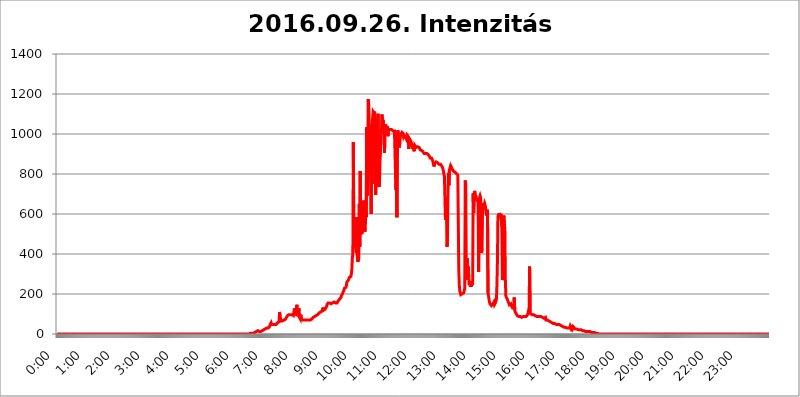
| Category | 2016.09.26. Intenzitás [W/m^2] |
|---|---|
| 0.0 | 0 |
| 0.0006944444444444445 | 0 |
| 0.001388888888888889 | 0 |
| 0.0020833333333333333 | 0 |
| 0.002777777777777778 | 0 |
| 0.003472222222222222 | 0 |
| 0.004166666666666667 | 0 |
| 0.004861111111111111 | 0 |
| 0.005555555555555556 | 0 |
| 0.0062499999999999995 | 0 |
| 0.006944444444444444 | 0 |
| 0.007638888888888889 | 0 |
| 0.008333333333333333 | 0 |
| 0.009027777777777779 | 0 |
| 0.009722222222222222 | 0 |
| 0.010416666666666666 | 0 |
| 0.011111111111111112 | 0 |
| 0.011805555555555555 | 0 |
| 0.012499999999999999 | 0 |
| 0.013194444444444444 | 0 |
| 0.013888888888888888 | 0 |
| 0.014583333333333332 | 0 |
| 0.015277777777777777 | 0 |
| 0.015972222222222224 | 0 |
| 0.016666666666666666 | 0 |
| 0.017361111111111112 | 0 |
| 0.018055555555555557 | 0 |
| 0.01875 | 0 |
| 0.019444444444444445 | 0 |
| 0.02013888888888889 | 0 |
| 0.020833333333333332 | 0 |
| 0.02152777777777778 | 0 |
| 0.022222222222222223 | 0 |
| 0.02291666666666667 | 0 |
| 0.02361111111111111 | 0 |
| 0.024305555555555556 | 0 |
| 0.024999999999999998 | 0 |
| 0.025694444444444447 | 0 |
| 0.02638888888888889 | 0 |
| 0.027083333333333334 | 0 |
| 0.027777777777777776 | 0 |
| 0.02847222222222222 | 0 |
| 0.029166666666666664 | 0 |
| 0.029861111111111113 | 0 |
| 0.030555555555555555 | 0 |
| 0.03125 | 0 |
| 0.03194444444444445 | 0 |
| 0.03263888888888889 | 0 |
| 0.03333333333333333 | 0 |
| 0.034027777777777775 | 0 |
| 0.034722222222222224 | 0 |
| 0.035416666666666666 | 0 |
| 0.036111111111111115 | 0 |
| 0.03680555555555556 | 0 |
| 0.0375 | 0 |
| 0.03819444444444444 | 0 |
| 0.03888888888888889 | 0 |
| 0.03958333333333333 | 0 |
| 0.04027777777777778 | 0 |
| 0.04097222222222222 | 0 |
| 0.041666666666666664 | 0 |
| 0.042361111111111106 | 0 |
| 0.04305555555555556 | 0 |
| 0.043750000000000004 | 0 |
| 0.044444444444444446 | 0 |
| 0.04513888888888889 | 0 |
| 0.04583333333333334 | 0 |
| 0.04652777777777778 | 0 |
| 0.04722222222222222 | 0 |
| 0.04791666666666666 | 0 |
| 0.04861111111111111 | 0 |
| 0.049305555555555554 | 0 |
| 0.049999999999999996 | 0 |
| 0.05069444444444445 | 0 |
| 0.051388888888888894 | 0 |
| 0.052083333333333336 | 0 |
| 0.05277777777777778 | 0 |
| 0.05347222222222222 | 0 |
| 0.05416666666666667 | 0 |
| 0.05486111111111111 | 0 |
| 0.05555555555555555 | 0 |
| 0.05625 | 0 |
| 0.05694444444444444 | 0 |
| 0.057638888888888885 | 0 |
| 0.05833333333333333 | 0 |
| 0.05902777777777778 | 0 |
| 0.059722222222222225 | 0 |
| 0.06041666666666667 | 0 |
| 0.061111111111111116 | 0 |
| 0.06180555555555556 | 0 |
| 0.0625 | 0 |
| 0.06319444444444444 | 0 |
| 0.06388888888888888 | 0 |
| 0.06458333333333334 | 0 |
| 0.06527777777777778 | 0 |
| 0.06597222222222222 | 0 |
| 0.06666666666666667 | 0 |
| 0.06736111111111111 | 0 |
| 0.06805555555555555 | 0 |
| 0.06874999999999999 | 0 |
| 0.06944444444444443 | 0 |
| 0.07013888888888889 | 0 |
| 0.07083333333333333 | 0 |
| 0.07152777777777779 | 0 |
| 0.07222222222222223 | 0 |
| 0.07291666666666667 | 0 |
| 0.07361111111111111 | 0 |
| 0.07430555555555556 | 0 |
| 0.075 | 0 |
| 0.07569444444444444 | 0 |
| 0.0763888888888889 | 0 |
| 0.07708333333333334 | 0 |
| 0.07777777777777778 | 0 |
| 0.07847222222222222 | 0 |
| 0.07916666666666666 | 0 |
| 0.0798611111111111 | 0 |
| 0.08055555555555556 | 0 |
| 0.08125 | 0 |
| 0.08194444444444444 | 0 |
| 0.08263888888888889 | 0 |
| 0.08333333333333333 | 0 |
| 0.08402777777777777 | 0 |
| 0.08472222222222221 | 0 |
| 0.08541666666666665 | 0 |
| 0.08611111111111112 | 0 |
| 0.08680555555555557 | 0 |
| 0.08750000000000001 | 0 |
| 0.08819444444444445 | 0 |
| 0.08888888888888889 | 0 |
| 0.08958333333333333 | 0 |
| 0.09027777777777778 | 0 |
| 0.09097222222222222 | 0 |
| 0.09166666666666667 | 0 |
| 0.09236111111111112 | 0 |
| 0.09305555555555556 | 0 |
| 0.09375 | 0 |
| 0.09444444444444444 | 0 |
| 0.09513888888888888 | 0 |
| 0.09583333333333333 | 0 |
| 0.09652777777777777 | 0 |
| 0.09722222222222222 | 0 |
| 0.09791666666666667 | 0 |
| 0.09861111111111111 | 0 |
| 0.09930555555555555 | 0 |
| 0.09999999999999999 | 0 |
| 0.10069444444444443 | 0 |
| 0.1013888888888889 | 0 |
| 0.10208333333333335 | 0 |
| 0.10277777777777779 | 0 |
| 0.10347222222222223 | 0 |
| 0.10416666666666667 | 0 |
| 0.10486111111111111 | 0 |
| 0.10555555555555556 | 0 |
| 0.10625 | 0 |
| 0.10694444444444444 | 0 |
| 0.1076388888888889 | 0 |
| 0.10833333333333334 | 0 |
| 0.10902777777777778 | 0 |
| 0.10972222222222222 | 0 |
| 0.1111111111111111 | 0 |
| 0.11180555555555556 | 0 |
| 0.11180555555555556 | 0 |
| 0.1125 | 0 |
| 0.11319444444444444 | 0 |
| 0.11388888888888889 | 0 |
| 0.11458333333333333 | 0 |
| 0.11527777777777777 | 0 |
| 0.11597222222222221 | 0 |
| 0.11666666666666665 | 0 |
| 0.1173611111111111 | 0 |
| 0.11805555555555557 | 0 |
| 0.11944444444444445 | 0 |
| 0.12013888888888889 | 0 |
| 0.12083333333333333 | 0 |
| 0.12152777777777778 | 0 |
| 0.12222222222222223 | 0 |
| 0.12291666666666667 | 0 |
| 0.12291666666666667 | 0 |
| 0.12361111111111112 | 0 |
| 0.12430555555555556 | 0 |
| 0.125 | 0 |
| 0.12569444444444444 | 0 |
| 0.12638888888888888 | 0 |
| 0.12708333333333333 | 0 |
| 0.16875 | 0 |
| 0.12847222222222224 | 0 |
| 0.12916666666666668 | 0 |
| 0.12986111111111112 | 0 |
| 0.13055555555555556 | 0 |
| 0.13125 | 0 |
| 0.13194444444444445 | 0 |
| 0.1326388888888889 | 0 |
| 0.13333333333333333 | 0 |
| 0.13402777777777777 | 0 |
| 0.13402777777777777 | 0 |
| 0.13472222222222222 | 0 |
| 0.13541666666666666 | 0 |
| 0.1361111111111111 | 0 |
| 0.13749999999999998 | 0 |
| 0.13819444444444443 | 0 |
| 0.1388888888888889 | 0 |
| 0.13958333333333334 | 0 |
| 0.14027777777777778 | 0 |
| 0.14097222222222222 | 0 |
| 0.14166666666666666 | 0 |
| 0.1423611111111111 | 0 |
| 0.14305555555555557 | 0 |
| 0.14375000000000002 | 0 |
| 0.14444444444444446 | 0 |
| 0.1451388888888889 | 0 |
| 0.1451388888888889 | 0 |
| 0.14652777777777778 | 0 |
| 0.14722222222222223 | 0 |
| 0.14791666666666667 | 0 |
| 0.1486111111111111 | 0 |
| 0.14930555555555555 | 0 |
| 0.15 | 0 |
| 0.15069444444444444 | 0 |
| 0.15138888888888888 | 0 |
| 0.15208333333333332 | 0 |
| 0.15277777777777776 | 0 |
| 0.15347222222222223 | 0 |
| 0.15416666666666667 | 0 |
| 0.15486111111111112 | 0 |
| 0.15555555555555556 | 0 |
| 0.15625 | 0 |
| 0.15694444444444444 | 0 |
| 0.15763888888888888 | 0 |
| 0.15833333333333333 | 0 |
| 0.15902777777777777 | 0 |
| 0.15972222222222224 | 0 |
| 0.16041666666666668 | 0 |
| 0.16111111111111112 | 0 |
| 0.16180555555555556 | 0 |
| 0.1625 | 0 |
| 0.16319444444444445 | 0 |
| 0.1638888888888889 | 0 |
| 0.16458333333333333 | 0 |
| 0.16527777777777777 | 0 |
| 0.16597222222222222 | 0 |
| 0.16666666666666666 | 0 |
| 0.1673611111111111 | 0 |
| 0.16805555555555554 | 0 |
| 0.16874999999999998 | 0 |
| 0.16944444444444443 | 0 |
| 0.17013888888888887 | 0 |
| 0.1708333333333333 | 0 |
| 0.17152777777777775 | 0 |
| 0.17222222222222225 | 0 |
| 0.1729166666666667 | 0 |
| 0.17361111111111113 | 0 |
| 0.17430555555555557 | 0 |
| 0.17500000000000002 | 0 |
| 0.17569444444444446 | 0 |
| 0.1763888888888889 | 0 |
| 0.17708333333333334 | 0 |
| 0.17777777777777778 | 0 |
| 0.17847222222222223 | 0 |
| 0.17916666666666667 | 0 |
| 0.1798611111111111 | 0 |
| 0.18055555555555555 | 0 |
| 0.18125 | 0 |
| 0.18194444444444444 | 0 |
| 0.1826388888888889 | 0 |
| 0.18333333333333335 | 0 |
| 0.1840277777777778 | 0 |
| 0.18472222222222223 | 0 |
| 0.18541666666666667 | 0 |
| 0.18611111111111112 | 0 |
| 0.18680555555555556 | 0 |
| 0.1875 | 0 |
| 0.18819444444444444 | 0 |
| 0.18888888888888888 | 0 |
| 0.18958333333333333 | 0 |
| 0.19027777777777777 | 0 |
| 0.1909722222222222 | 0 |
| 0.19166666666666665 | 0 |
| 0.19236111111111112 | 0 |
| 0.19305555555555554 | 0 |
| 0.19375 | 0 |
| 0.19444444444444445 | 0 |
| 0.1951388888888889 | 0 |
| 0.19583333333333333 | 0 |
| 0.19652777777777777 | 0 |
| 0.19722222222222222 | 0 |
| 0.19791666666666666 | 0 |
| 0.1986111111111111 | 0 |
| 0.19930555555555554 | 0 |
| 0.19999999999999998 | 0 |
| 0.20069444444444443 | 0 |
| 0.20138888888888887 | 0 |
| 0.2020833333333333 | 0 |
| 0.2027777777777778 | 0 |
| 0.2034722222222222 | 0 |
| 0.2041666666666667 | 0 |
| 0.20486111111111113 | 0 |
| 0.20555555555555557 | 0 |
| 0.20625000000000002 | 0 |
| 0.20694444444444446 | 0 |
| 0.2076388888888889 | 0 |
| 0.20833333333333334 | 0 |
| 0.20902777777777778 | 0 |
| 0.20972222222222223 | 0 |
| 0.21041666666666667 | 0 |
| 0.2111111111111111 | 0 |
| 0.21180555555555555 | 0 |
| 0.2125 | 0 |
| 0.21319444444444444 | 0 |
| 0.2138888888888889 | 0 |
| 0.21458333333333335 | 0 |
| 0.2152777777777778 | 0 |
| 0.21597222222222223 | 0 |
| 0.21666666666666667 | 0 |
| 0.21736111111111112 | 0 |
| 0.21805555555555556 | 0 |
| 0.21875 | 0 |
| 0.21944444444444444 | 0 |
| 0.22013888888888888 | 0 |
| 0.22083333333333333 | 0 |
| 0.22152777777777777 | 0 |
| 0.2222222222222222 | 0 |
| 0.22291666666666665 | 0 |
| 0.2236111111111111 | 0 |
| 0.22430555555555556 | 0 |
| 0.225 | 0 |
| 0.22569444444444445 | 0 |
| 0.2263888888888889 | 0 |
| 0.22708333333333333 | 0 |
| 0.22777777777777777 | 0 |
| 0.22847222222222222 | 0 |
| 0.22916666666666666 | 0 |
| 0.2298611111111111 | 0 |
| 0.23055555555555554 | 0 |
| 0.23124999999999998 | 0 |
| 0.23194444444444443 | 0 |
| 0.23263888888888887 | 0 |
| 0.2333333333333333 | 0 |
| 0.2340277777777778 | 0 |
| 0.2347222222222222 | 0 |
| 0.2354166666666667 | 0 |
| 0.23611111111111113 | 0 |
| 0.23680555555555557 | 0 |
| 0.23750000000000002 | 0 |
| 0.23819444444444446 | 0 |
| 0.2388888888888889 | 0 |
| 0.23958333333333334 | 0 |
| 0.24027777777777778 | 0 |
| 0.24097222222222223 | 0 |
| 0.24166666666666667 | 0 |
| 0.2423611111111111 | 0 |
| 0.24305555555555555 | 0 |
| 0.24375 | 0 |
| 0.24444444444444446 | 0 |
| 0.24513888888888888 | 0 |
| 0.24583333333333335 | 0 |
| 0.2465277777777778 | 0 |
| 0.24722222222222223 | 0 |
| 0.24791666666666667 | 0 |
| 0.24861111111111112 | 0 |
| 0.24930555555555556 | 0 |
| 0.25 | 0 |
| 0.25069444444444444 | 0 |
| 0.2513888888888889 | 0 |
| 0.2520833333333333 | 0 |
| 0.25277777777777777 | 0 |
| 0.2534722222222222 | 0 |
| 0.25416666666666665 | 0 |
| 0.2548611111111111 | 0 |
| 0.2555555555555556 | 0 |
| 0.25625000000000003 | 0 |
| 0.2569444444444445 | 0 |
| 0.2576388888888889 | 0 |
| 0.25833333333333336 | 0 |
| 0.2590277777777778 | 0 |
| 0.25972222222222224 | 0 |
| 0.2604166666666667 | 0 |
| 0.2611111111111111 | 0 |
| 0.26180555555555557 | 0 |
| 0.2625 | 0 |
| 0.26319444444444445 | 0 |
| 0.2638888888888889 | 0 |
| 0.26458333333333334 | 0 |
| 0.2652777777777778 | 0 |
| 0.2659722222222222 | 0 |
| 0.26666666666666666 | 0 |
| 0.2673611111111111 | 0 |
| 0.26805555555555555 | 0 |
| 0.26875 | 0 |
| 0.26944444444444443 | 0 |
| 0.2701388888888889 | 3.525 |
| 0.2708333333333333 | 3.525 |
| 0.27152777777777776 | 3.525 |
| 0.2722222222222222 | 3.525 |
| 0.27291666666666664 | 3.525 |
| 0.2736111111111111 | 3.525 |
| 0.2743055555555555 | 3.525 |
| 0.27499999999999997 | 3.525 |
| 0.27569444444444446 | 3.525 |
| 0.27638888888888885 | 7.887 |
| 0.27708333333333335 | 7.887 |
| 0.2777777777777778 | 12.257 |
| 0.27847222222222223 | 12.257 |
| 0.2791666666666667 | 12.257 |
| 0.2798611111111111 | 16.636 |
| 0.28055555555555556 | 16.636 |
| 0.28125 | 16.636 |
| 0.28194444444444444 | 16.636 |
| 0.2826388888888889 | 16.636 |
| 0.2833333333333333 | 12.257 |
| 0.28402777777777777 | 12.257 |
| 0.2847222222222222 | 12.257 |
| 0.28541666666666665 | 12.257 |
| 0.28611111111111115 | 16.636 |
| 0.28680555555555554 | 16.636 |
| 0.28750000000000003 | 16.636 |
| 0.2881944444444445 | 16.636 |
| 0.2888888888888889 | 21.024 |
| 0.28958333333333336 | 21.024 |
| 0.2902777777777778 | 21.024 |
| 0.29097222222222224 | 25.419 |
| 0.2916666666666667 | 25.419 |
| 0.2923611111111111 | 25.419 |
| 0.29305555555555557 | 25.419 |
| 0.29375 | 29.823 |
| 0.29444444444444445 | 29.823 |
| 0.2951388888888889 | 29.823 |
| 0.29583333333333334 | 29.823 |
| 0.2965277777777778 | 34.234 |
| 0.2972222222222222 | 34.234 |
| 0.29791666666666666 | 38.653 |
| 0.2986111111111111 | 47.511 |
| 0.29930555555555555 | 47.511 |
| 0.3 | 56.398 |
| 0.30069444444444443 | 47.511 |
| 0.3013888888888889 | 47.511 |
| 0.3020833333333333 | 47.511 |
| 0.30277777777777776 | 47.511 |
| 0.3034722222222222 | 43.079 |
| 0.30416666666666664 | 47.511 |
| 0.3048611111111111 | 47.511 |
| 0.3055555555555555 | 47.511 |
| 0.30624999999999997 | 47.511 |
| 0.3069444444444444 | 47.511 |
| 0.3076388888888889 | 51.951 |
| 0.30833333333333335 | 51.951 |
| 0.3090277777777778 | 56.398 |
| 0.30972222222222223 | 56.398 |
| 0.3104166666666667 | 60.85 |
| 0.3111111111111111 | 60.85 |
| 0.31180555555555556 | 110.201 |
| 0.3125 | 87.692 |
| 0.31319444444444444 | 78.722 |
| 0.3138888888888889 | 65.31 |
| 0.3145833333333333 | 65.31 |
| 0.31527777777777777 | 65.31 |
| 0.3159722222222222 | 65.31 |
| 0.31666666666666665 | 65.31 |
| 0.31736111111111115 | 65.31 |
| 0.31805555555555554 | 69.775 |
| 0.31875000000000003 | 74.246 |
| 0.3194444444444445 | 74.246 |
| 0.3201388888888889 | 74.246 |
| 0.32083333333333336 | 78.722 |
| 0.3215277777777778 | 83.205 |
| 0.32222222222222224 | 83.205 |
| 0.3229166666666667 | 92.184 |
| 0.3236111111111111 | 92.184 |
| 0.32430555555555557 | 96.682 |
| 0.325 | 96.682 |
| 0.32569444444444445 | 96.682 |
| 0.3263888888888889 | 96.682 |
| 0.32708333333333334 | 96.682 |
| 0.3277777777777778 | 96.682 |
| 0.3284722222222222 | 92.184 |
| 0.32916666666666666 | 96.682 |
| 0.3298611111111111 | 92.184 |
| 0.33055555555555555 | 92.184 |
| 0.33125 | 92.184 |
| 0.33194444444444443 | 96.682 |
| 0.3326388888888889 | 128.284 |
| 0.3333333333333333 | 101.184 |
| 0.3340277777777778 | 101.184 |
| 0.3347222222222222 | 101.184 |
| 0.3354166666666667 | 96.682 |
| 0.3361111111111111 | 146.423 |
| 0.3368055555555556 | 96.682 |
| 0.33749999999999997 | 92.184 |
| 0.33819444444444446 | 92.184 |
| 0.33888888888888885 | 128.284 |
| 0.33958333333333335 | 83.205 |
| 0.34027777777777773 | 78.722 |
| 0.34097222222222223 | 74.246 |
| 0.3416666666666666 | 96.682 |
| 0.3423611111111111 | 74.246 |
| 0.3430555555555555 | 69.775 |
| 0.34375 | 69.775 |
| 0.3444444444444445 | 69.775 |
| 0.3451388888888889 | 69.775 |
| 0.3458333333333334 | 69.775 |
| 0.34652777777777777 | 69.775 |
| 0.34722222222222227 | 69.775 |
| 0.34791666666666665 | 69.775 |
| 0.34861111111111115 | 69.775 |
| 0.34930555555555554 | 69.775 |
| 0.35000000000000003 | 69.775 |
| 0.3506944444444444 | 69.775 |
| 0.3513888888888889 | 69.775 |
| 0.3520833333333333 | 69.775 |
| 0.3527777777777778 | 69.775 |
| 0.3534722222222222 | 69.775 |
| 0.3541666666666667 | 69.775 |
| 0.3548611111111111 | 69.775 |
| 0.35555555555555557 | 74.246 |
| 0.35625 | 74.246 |
| 0.35694444444444445 | 74.246 |
| 0.3576388888888889 | 74.246 |
| 0.35833333333333334 | 78.722 |
| 0.3590277777777778 | 83.205 |
| 0.3597222222222222 | 83.205 |
| 0.36041666666666666 | 83.205 |
| 0.3611111111111111 | 87.692 |
| 0.36180555555555555 | 87.692 |
| 0.3625 | 92.184 |
| 0.36319444444444443 | 92.184 |
| 0.3638888888888889 | 92.184 |
| 0.3645833333333333 | 96.682 |
| 0.3652777777777778 | 96.682 |
| 0.3659722222222222 | 101.184 |
| 0.3666666666666667 | 101.184 |
| 0.3673611111111111 | 105.69 |
| 0.3680555555555556 | 110.201 |
| 0.36874999999999997 | 110.201 |
| 0.36944444444444446 | 110.201 |
| 0.37013888888888885 | 110.201 |
| 0.37083333333333335 | 110.201 |
| 0.37152777777777773 | 114.716 |
| 0.37222222222222223 | 119.235 |
| 0.3729166666666666 | 132.814 |
| 0.3736111111111111 | 119.235 |
| 0.3743055555555555 | 123.758 |
| 0.375 | 123.758 |
| 0.3756944444444445 | 123.758 |
| 0.3763888888888889 | 128.284 |
| 0.3770833333333334 | 132.814 |
| 0.37777777777777777 | 137.347 |
| 0.37847222222222227 | 146.423 |
| 0.37916666666666665 | 150.964 |
| 0.37986111111111115 | 155.509 |
| 0.38055555555555554 | 155.509 |
| 0.38125000000000003 | 155.509 |
| 0.3819444444444444 | 155.509 |
| 0.3826388888888889 | 155.509 |
| 0.3833333333333333 | 150.964 |
| 0.3840277777777778 | 150.964 |
| 0.3847222222222222 | 155.509 |
| 0.3854166666666667 | 155.509 |
| 0.3861111111111111 | 155.509 |
| 0.38680555555555557 | 160.056 |
| 0.3875 | 160.056 |
| 0.38819444444444445 | 160.056 |
| 0.3888888888888889 | 160.056 |
| 0.38958333333333334 | 155.509 |
| 0.3902777777777778 | 155.509 |
| 0.3909722222222222 | 155.509 |
| 0.39166666666666666 | 155.509 |
| 0.3923611111111111 | 155.509 |
| 0.39305555555555555 | 160.056 |
| 0.39375 | 164.605 |
| 0.39444444444444443 | 164.605 |
| 0.3951388888888889 | 169.156 |
| 0.3958333333333333 | 173.709 |
| 0.3965277777777778 | 173.709 |
| 0.3972222222222222 | 178.264 |
| 0.3979166666666667 | 182.82 |
| 0.3986111111111111 | 191.937 |
| 0.3993055555555556 | 196.497 |
| 0.39999999999999997 | 201.058 |
| 0.40069444444444446 | 201.058 |
| 0.40138888888888885 | 205.62 |
| 0.40208333333333335 | 219.309 |
| 0.40277777777777773 | 228.436 |
| 0.40347222222222223 | 233 |
| 0.4041666666666666 | 233 |
| 0.4048611111111111 | 233 |
| 0.4055555555555555 | 242.127 |
| 0.40625 | 260.373 |
| 0.4069444444444445 | 260.373 |
| 0.4076388888888889 | 264.932 |
| 0.4083333333333334 | 269.49 |
| 0.40902777777777777 | 274.047 |
| 0.40972222222222227 | 283.156 |
| 0.41041666666666665 | 283.156 |
| 0.41111111111111115 | 283.156 |
| 0.41180555555555554 | 287.709 |
| 0.41250000000000003 | 301.354 |
| 0.4131944444444444 | 324.052 |
| 0.4138888888888889 | 378.224 |
| 0.4145833333333333 | 405.108 |
| 0.4152777777777778 | 958.814 |
| 0.4159722222222222 | 480.356 |
| 0.4166666666666667 | 510.885 |
| 0.4173611111111111 | 484.735 |
| 0.41805555555555557 | 445.129 |
| 0.41875 | 449.551 |
| 0.41944444444444445 | 405.108 |
| 0.4201388888888889 | 583.779 |
| 0.42083333333333334 | 387.202 |
| 0.4215277777777778 | 360.221 |
| 0.4222222222222222 | 360.221 |
| 0.42291666666666666 | 378.224 |
| 0.4236111111111111 | 650.667 |
| 0.42430555555555555 | 436.27 |
| 0.425 | 814.519 |
| 0.42569444444444443 | 497.836 |
| 0.4263888888888889 | 541.121 |
| 0.4270833333333333 | 502.192 |
| 0.4277777777777778 | 510.885 |
| 0.4284722222222222 | 532.513 |
| 0.4291666666666667 | 588.009 |
| 0.4298611111111111 | 667.123 |
| 0.4305555555555556 | 600.661 |
| 0.43124999999999997 | 510.885 |
| 0.43194444444444446 | 523.88 |
| 0.43263888888888885 | 604.864 |
| 0.43333333333333335 | 583.779 |
| 0.43402777777777773 | 1033.537 |
| 0.43472222222222223 | 691.608 |
| 0.4354166666666666 | 775.492 |
| 0.4361111111111111 | 1174.263 |
| 0.4368055555555555 | 1147.086 |
| 0.4375 | 1150.946 |
| 0.4381944444444445 | 973.772 |
| 0.4388888888888889 | 977.508 |
| 0.4395833333333334 | 771.559 |
| 0.44027777777777777 | 600.661 |
| 0.44097222222222227 | 1048.508 |
| 0.44166666666666665 | 751.803 |
| 0.44236111111111115 | 1078.555 |
| 0.44305555555555554 | 1112.618 |
| 0.44375000000000003 | 1108.816 |
| 0.4444444444444444 | 1105.019 |
| 0.4451388888888889 | 1112.618 |
| 0.4458333333333333 | 1007.383 |
| 0.4465277777777778 | 695.666 |
| 0.4472222222222222 | 806.757 |
| 0.4479166666666667 | 829.981 |
| 0.4486111111111111 | 735.89 |
| 0.44930555555555557 | 1074.789 |
| 0.45 | 1101.226 |
| 0.45069444444444445 | 921.298 |
| 0.4513888888888889 | 735.89 |
| 0.45208333333333334 | 771.559 |
| 0.4527777777777778 | 875.918 |
| 0.4534722222222222 | 909.996 |
| 0.45416666666666666 | 996.182 |
| 0.4548611111111111 | 1026.06 |
| 0.45555555555555555 | 1097.437 |
| 0.45625 | 1003.65 |
| 0.45694444444444443 | 1071.027 |
| 0.4576388888888889 | 1007.383 |
| 0.4583333333333333 | 1029.798 |
| 0.4590277777777778 | 906.223 |
| 0.4597222222222222 | 1037.277 |
| 0.4604166666666667 | 1048.508 |
| 0.4611111111111111 | 1037.277 |
| 0.4618055555555556 | 1037.277 |
| 0.46249999999999997 | 1033.537 |
| 0.46319444444444446 | 1033.537 |
| 0.46388888888888885 | 988.714 |
| 0.46458333333333335 | 1026.06 |
| 0.46527777777777773 | 1022.323 |
| 0.46597222222222223 | 1022.323 |
| 0.4666666666666666 | 1022.323 |
| 0.4673611111111111 | 1022.323 |
| 0.4680555555555555 | 1022.323 |
| 0.46875 | 1022.323 |
| 0.4694444444444445 | 1018.587 |
| 0.4701388888888889 | 1018.587 |
| 0.4708333333333334 | 1014.852 |
| 0.47152777777777777 | 1018.587 |
| 0.47222222222222227 | 1014.852 |
| 0.47291666666666665 | 1014.852 |
| 0.47361111111111115 | 1014.852 |
| 0.47430555555555554 | 1011.118 |
| 0.47500000000000003 | 719.877 |
| 0.4756944444444444 | 798.974 |
| 0.4763888888888889 | 583.779 |
| 0.4770833333333333 | 988.714 |
| 0.4777777777777778 | 1018.587 |
| 0.4784722222222222 | 1022.323 |
| 0.4791666666666667 | 1014.852 |
| 0.4798611111111111 | 932.576 |
| 0.48055555555555557 | 962.555 |
| 0.48125 | 988.714 |
| 0.48194444444444445 | 999.916 |
| 0.4826388888888889 | 1003.65 |
| 0.48333333333333334 | 1007.383 |
| 0.4840277777777778 | 1003.65 |
| 0.4847222222222222 | 999.916 |
| 0.48541666666666666 | 988.714 |
| 0.4861111111111111 | 996.182 |
| 0.48680555555555555 | 992.448 |
| 0.4875 | 992.448 |
| 0.48819444444444443 | 984.98 |
| 0.4888888888888889 | 984.98 |
| 0.4895833333333333 | 984.98 |
| 0.4902777777777778 | 970.034 |
| 0.4909722222222222 | 992.448 |
| 0.4916666666666667 | 992.448 |
| 0.4923611111111111 | 984.98 |
| 0.4930555555555556 | 925.06 |
| 0.49374999999999997 | 977.508 |
| 0.49444444444444446 | 977.508 |
| 0.49513888888888885 | 970.034 |
| 0.49583333333333335 | 966.295 |
| 0.49652777777777773 | 970.034 |
| 0.49722222222222223 | 951.327 |
| 0.4979166666666666 | 955.071 |
| 0.4986111111111111 | 925.06 |
| 0.4993055555555555 | 947.58 |
| 0.5 | 947.58 |
| 0.5006944444444444 | 913.766 |
| 0.5013888888888889 | 943.832 |
| 0.5020833333333333 | 940.082 |
| 0.5027777777777778 | 940.082 |
| 0.5034722222222222 | 932.576 |
| 0.5041666666666667 | 928.819 |
| 0.5048611111111111 | 936.33 |
| 0.5055555555555555 | 936.33 |
| 0.50625 | 936.33 |
| 0.5069444444444444 | 936.33 |
| 0.5076388888888889 | 932.576 |
| 0.5083333333333333 | 928.819 |
| 0.5090277777777777 | 921.298 |
| 0.5097222222222222 | 925.06 |
| 0.5104166666666666 | 921.298 |
| 0.5111111111111112 | 917.534 |
| 0.5118055555555555 | 917.534 |
| 0.5125000000000001 | 913.766 |
| 0.5131944444444444 | 909.996 |
| 0.513888888888889 | 909.996 |
| 0.5145833333333333 | 902.447 |
| 0.5152777777777778 | 902.447 |
| 0.5159722222222222 | 902.447 |
| 0.5166666666666667 | 902.447 |
| 0.517361111111111 | 906.223 |
| 0.5180555555555556 | 902.447 |
| 0.5187499999999999 | 902.447 |
| 0.5194444444444445 | 902.447 |
| 0.5201388888888888 | 898.668 |
| 0.5208333333333334 | 894.885 |
| 0.5215277777777778 | 891.099 |
| 0.5222222222222223 | 887.309 |
| 0.5229166666666667 | 879.719 |
| 0.5236111111111111 | 879.719 |
| 0.5243055555555556 | 875.918 |
| 0.525 | 879.719 |
| 0.5256944444444445 | 875.918 |
| 0.5263888888888889 | 868.305 |
| 0.5270833333333333 | 868.305 |
| 0.5277777777777778 | 872.114 |
| 0.5284722222222222 | 837.682 |
| 0.5291666666666667 | 853.029 |
| 0.5298611111111111 | 853.029 |
| 0.5305555555555556 | 856.855 |
| 0.53125 | 860.676 |
| 0.5319444444444444 | 860.676 |
| 0.5326388888888889 | 860.676 |
| 0.5333333333333333 | 856.855 |
| 0.5340277777777778 | 856.855 |
| 0.5347222222222222 | 853.029 |
| 0.5354166666666667 | 849.199 |
| 0.5361111111111111 | 845.365 |
| 0.5368055555555555 | 849.199 |
| 0.5375 | 849.199 |
| 0.5381944444444444 | 845.365 |
| 0.5388888888888889 | 841.526 |
| 0.5395833333333333 | 837.682 |
| 0.5402777777777777 | 833.834 |
| 0.5409722222222222 | 829.981 |
| 0.5416666666666666 | 814.519 |
| 0.5423611111111112 | 798.974 |
| 0.5430555555555555 | 787.258 |
| 0.5437500000000001 | 787.258 |
| 0.5444444444444444 | 571.049 |
| 0.545138888888889 | 683.473 |
| 0.5458333333333333 | 642.4 |
| 0.5465277777777778 | 436.27 |
| 0.5472222222222222 | 453.968 |
| 0.5479166666666667 | 691.608 |
| 0.548611111111111 | 802.868 |
| 0.5493055555555556 | 743.859 |
| 0.5499999999999999 | 818.392 |
| 0.5506944444444445 | 822.26 |
| 0.5513888888888888 | 837.682 |
| 0.5520833333333334 | 829.981 |
| 0.5527777777777778 | 818.392 |
| 0.5534722222222223 | 829.981 |
| 0.5541666666666667 | 826.123 |
| 0.5548611111111111 | 826.123 |
| 0.5555555555555556 | 814.519 |
| 0.55625 | 814.519 |
| 0.5569444444444445 | 810.641 |
| 0.5576388888888889 | 810.641 |
| 0.5583333333333333 | 814.519 |
| 0.5590277777777778 | 810.641 |
| 0.5597222222222222 | 802.868 |
| 0.5604166666666667 | 798.974 |
| 0.5611111111111111 | 798.974 |
| 0.5618055555555556 | 795.074 |
| 0.5625 | 795.074 |
| 0.5631944444444444 | 319.517 |
| 0.5638888888888889 | 246.689 |
| 0.5645833333333333 | 214.746 |
| 0.5652777777777778 | 210.182 |
| 0.5659722222222222 | 196.497 |
| 0.5666666666666667 | 196.497 |
| 0.5673611111111111 | 196.497 |
| 0.5680555555555555 | 201.058 |
| 0.56875 | 201.058 |
| 0.5694444444444444 | 201.058 |
| 0.5701388888888889 | 205.62 |
| 0.5708333333333333 | 210.182 |
| 0.5715277777777777 | 228.436 |
| 0.5722222222222222 | 767.62 |
| 0.5729166666666666 | 747.834 |
| 0.5736111111111112 | 364.728 |
| 0.5743055555555555 | 278.603 |
| 0.5750000000000001 | 378.224 |
| 0.5756944444444444 | 269.49 |
| 0.576388888888889 | 337.639 |
| 0.5770833333333333 | 287.709 |
| 0.5777777777777778 | 246.689 |
| 0.5784722222222222 | 264.932 |
| 0.5791666666666667 | 242.127 |
| 0.579861111111111 | 237.564 |
| 0.5805555555555556 | 237.564 |
| 0.5812499999999999 | 242.127 |
| 0.5819444444444445 | 242.127 |
| 0.5826388888888888 | 251.251 |
| 0.5833333333333334 | 703.762 |
| 0.5840277777777778 | 604.864 |
| 0.5847222222222223 | 679.395 |
| 0.5854166666666667 | 715.858 |
| 0.5861111111111111 | 695.666 |
| 0.5868055555555556 | 695.666 |
| 0.5875 | 687.544 |
| 0.5881944444444445 | 675.311 |
| 0.5888888888888889 | 667.123 |
| 0.5895833333333333 | 667.123 |
| 0.5902777777777778 | 658.909 |
| 0.5909722222222222 | 310.44 |
| 0.5916666666666667 | 634.105 |
| 0.5923611111111111 | 683.473 |
| 0.5930555555555556 | 691.608 |
| 0.59375 | 683.473 |
| 0.5944444444444444 | 600.661 |
| 0.5951388888888889 | 405.108 |
| 0.5958333333333333 | 427.39 |
| 0.5965277777777778 | 638.256 |
| 0.5972222222222222 | 625.784 |
| 0.5979166666666667 | 654.791 |
| 0.5986111111111111 | 646.537 |
| 0.5993055555555555 | 654.791 |
| 0.6 | 646.537 |
| 0.6006944444444444 | 634.105 |
| 0.6013888888888889 | 609.062 |
| 0.6020833333333333 | 592.233 |
| 0.6027777777777777 | 600.661 |
| 0.6034722222222222 | 621.613 |
| 0.6041666666666666 | 205.62 |
| 0.6048611111111112 | 191.937 |
| 0.6055555555555555 | 173.709 |
| 0.6062500000000001 | 160.056 |
| 0.6069444444444444 | 150.964 |
| 0.607638888888889 | 150.964 |
| 0.6083333333333333 | 150.964 |
| 0.6090277777777778 | 141.884 |
| 0.6097222222222222 | 141.884 |
| 0.6104166666666667 | 137.347 |
| 0.611111111111111 | 150.964 |
| 0.6118055555555556 | 155.509 |
| 0.6124999999999999 | 160.056 |
| 0.6131944444444445 | 146.423 |
| 0.6138888888888888 | 150.964 |
| 0.6145833333333334 | 155.509 |
| 0.6152777777777778 | 164.605 |
| 0.6159722222222223 | 173.709 |
| 0.6166666666666667 | 242.127 |
| 0.6173611111111111 | 360.221 |
| 0.6180555555555556 | 583.779 |
| 0.61875 | 600.661 |
| 0.6194444444444445 | 579.542 |
| 0.6201388888888889 | 604.864 |
| 0.6208333333333333 | 609.062 |
| 0.6215277777777778 | 588.009 |
| 0.6222222222222222 | 600.661 |
| 0.6229166666666667 | 600.661 |
| 0.6236111111111111 | 536.82 |
| 0.6243055555555556 | 269.49 |
| 0.625 | 287.709 |
| 0.6256944444444444 | 575.299 |
| 0.6263888888888889 | 592.233 |
| 0.6270833333333333 | 549.704 |
| 0.6277777777777778 | 528.2 |
| 0.6284722222222222 | 274.047 |
| 0.6291666666666667 | 191.937 |
| 0.6298611111111111 | 182.82 |
| 0.6305555555555555 | 178.264 |
| 0.63125 | 173.709 |
| 0.6319444444444444 | 169.156 |
| 0.6326388888888889 | 160.056 |
| 0.6333333333333333 | 155.509 |
| 0.6340277777777777 | 146.423 |
| 0.6347222222222222 | 146.423 |
| 0.6354166666666666 | 146.423 |
| 0.6361111111111112 | 150.964 |
| 0.6368055555555555 | 141.884 |
| 0.6375000000000001 | 141.884 |
| 0.6381944444444444 | 132.814 |
| 0.638888888888889 | 132.814 |
| 0.6395833333333333 | 132.814 |
| 0.6402777777777778 | 141.884 |
| 0.6409722222222222 | 182.82 |
| 0.6416666666666667 | 119.235 |
| 0.642361111111111 | 110.201 |
| 0.6430555555555556 | 105.69 |
| 0.6437499999999999 | 101.184 |
| 0.6444444444444445 | 96.682 |
| 0.6451388888888888 | 92.184 |
| 0.6458333333333334 | 92.184 |
| 0.6465277777777778 | 87.692 |
| 0.6472222222222223 | 87.692 |
| 0.6479166666666667 | 87.692 |
| 0.6486111111111111 | 87.692 |
| 0.6493055555555556 | 87.692 |
| 0.65 | 83.205 |
| 0.6506944444444445 | 83.205 |
| 0.6513888888888889 | 83.205 |
| 0.6520833333333333 | 83.205 |
| 0.6527777777777778 | 87.692 |
| 0.6534722222222222 | 87.692 |
| 0.6541666666666667 | 87.692 |
| 0.6548611111111111 | 87.692 |
| 0.6555555555555556 | 87.692 |
| 0.65625 | 87.692 |
| 0.6569444444444444 | 87.692 |
| 0.6576388888888889 | 87.692 |
| 0.6583333333333333 | 92.184 |
| 0.6590277777777778 | 92.184 |
| 0.6597222222222222 | 96.682 |
| 0.6604166666666667 | 101.184 |
| 0.6611111111111111 | 119.235 |
| 0.6618055555555555 | 128.284 |
| 0.6625 | 337.639 |
| 0.6631944444444444 | 114.716 |
| 0.6638888888888889 | 101.184 |
| 0.6645833333333333 | 101.184 |
| 0.6652777777777777 | 96.682 |
| 0.6659722222222222 | 96.682 |
| 0.6666666666666666 | 96.682 |
| 0.6673611111111111 | 96.682 |
| 0.6680555555555556 | 96.682 |
| 0.6687500000000001 | 92.184 |
| 0.6694444444444444 | 92.184 |
| 0.6701388888888888 | 92.184 |
| 0.6708333333333334 | 92.184 |
| 0.6715277777777778 | 87.692 |
| 0.6722222222222222 | 87.692 |
| 0.6729166666666666 | 87.692 |
| 0.6736111111111112 | 87.692 |
| 0.6743055555555556 | 87.692 |
| 0.6749999999999999 | 87.692 |
| 0.6756944444444444 | 87.692 |
| 0.6763888888888889 | 87.692 |
| 0.6770833333333334 | 87.692 |
| 0.6777777777777777 | 87.692 |
| 0.6784722222222223 | 87.692 |
| 0.6791666666666667 | 83.205 |
| 0.6798611111111111 | 83.205 |
| 0.6805555555555555 | 83.205 |
| 0.68125 | 83.205 |
| 0.6819444444444445 | 78.722 |
| 0.6826388888888889 | 78.722 |
| 0.6833333333333332 | 74.246 |
| 0.6840277777777778 | 74.246 |
| 0.6847222222222222 | 83.205 |
| 0.6854166666666667 | 69.775 |
| 0.686111111111111 | 69.775 |
| 0.6868055555555556 | 69.775 |
| 0.6875 | 69.775 |
| 0.6881944444444444 | 65.31 |
| 0.688888888888889 | 65.31 |
| 0.6895833333333333 | 65.31 |
| 0.6902777777777778 | 60.85 |
| 0.6909722222222222 | 60.85 |
| 0.6916666666666668 | 60.85 |
| 0.6923611111111111 | 56.398 |
| 0.6930555555555555 | 56.398 |
| 0.69375 | 56.398 |
| 0.6944444444444445 | 56.398 |
| 0.6951388888888889 | 56.398 |
| 0.6958333333333333 | 51.951 |
| 0.6965277777777777 | 51.951 |
| 0.6972222222222223 | 51.951 |
| 0.6979166666666666 | 51.951 |
| 0.6986111111111111 | 51.951 |
| 0.6993055555555556 | 51.951 |
| 0.7000000000000001 | 47.511 |
| 0.7006944444444444 | 47.511 |
| 0.7013888888888888 | 47.511 |
| 0.7020833333333334 | 47.511 |
| 0.7027777777777778 | 47.511 |
| 0.7034722222222222 | 47.511 |
| 0.7041666666666666 | 47.511 |
| 0.7048611111111112 | 43.079 |
| 0.7055555555555556 | 43.079 |
| 0.7062499999999999 | 43.079 |
| 0.7069444444444444 | 38.653 |
| 0.7076388888888889 | 38.653 |
| 0.7083333333333334 | 38.653 |
| 0.7090277777777777 | 38.653 |
| 0.7097222222222223 | 38.653 |
| 0.7104166666666667 | 34.234 |
| 0.7111111111111111 | 34.234 |
| 0.7118055555555555 | 34.234 |
| 0.7125 | 34.234 |
| 0.7131944444444445 | 34.234 |
| 0.7138888888888889 | 29.823 |
| 0.7145833333333332 | 29.823 |
| 0.7152777777777778 | 29.823 |
| 0.7159722222222222 | 29.823 |
| 0.7166666666666667 | 29.823 |
| 0.717361111111111 | 25.419 |
| 0.7180555555555556 | 29.823 |
| 0.71875 | 29.823 |
| 0.7194444444444444 | 38.653 |
| 0.720138888888889 | 34.234 |
| 0.7208333333333333 | 25.419 |
| 0.7215277777777778 | 25.419 |
| 0.7222222222222222 | 34.234 |
| 0.7229166666666668 | 25.419 |
| 0.7236111111111111 | 29.823 |
| 0.7243055555555555 | 34.234 |
| 0.725 | 38.653 |
| 0.7256944444444445 | 38.653 |
| 0.7263888888888889 | 25.419 |
| 0.7270833333333333 | 25.419 |
| 0.7277777777777777 | 29.823 |
| 0.7284722222222223 | 25.419 |
| 0.7291666666666666 | 21.024 |
| 0.7298611111111111 | 21.024 |
| 0.7305555555555556 | 21.024 |
| 0.7312500000000001 | 21.024 |
| 0.7319444444444444 | 21.024 |
| 0.7326388888888888 | 21.024 |
| 0.7333333333333334 | 21.024 |
| 0.7340277777777778 | 21.024 |
| 0.7347222222222222 | 21.024 |
| 0.7354166666666666 | 16.636 |
| 0.7361111111111112 | 16.636 |
| 0.7368055555555556 | 16.636 |
| 0.7374999999999999 | 16.636 |
| 0.7381944444444444 | 16.636 |
| 0.7388888888888889 | 16.636 |
| 0.7395833333333334 | 16.636 |
| 0.7402777777777777 | 16.636 |
| 0.7409722222222223 | 12.257 |
| 0.7416666666666667 | 12.257 |
| 0.7423611111111111 | 12.257 |
| 0.7430555555555555 | 12.257 |
| 0.74375 | 12.257 |
| 0.7444444444444445 | 12.257 |
| 0.7451388888888889 | 12.257 |
| 0.7458333333333332 | 12.257 |
| 0.7465277777777778 | 12.257 |
| 0.7472222222222222 | 12.257 |
| 0.7479166666666667 | 12.257 |
| 0.748611111111111 | 12.257 |
| 0.7493055555555556 | 7.887 |
| 0.75 | 7.887 |
| 0.7506944444444444 | 7.887 |
| 0.751388888888889 | 7.887 |
| 0.7520833333333333 | 7.887 |
| 0.7527777777777778 | 7.887 |
| 0.7534722222222222 | 7.887 |
| 0.7541666666666668 | 7.887 |
| 0.7548611111111111 | 3.525 |
| 0.7555555555555555 | 3.525 |
| 0.75625 | 3.525 |
| 0.7569444444444445 | 3.525 |
| 0.7576388888888889 | 3.525 |
| 0.7583333333333333 | 3.525 |
| 0.7590277777777777 | 3.525 |
| 0.7597222222222223 | 0 |
| 0.7604166666666666 | 0 |
| 0.7611111111111111 | 0 |
| 0.7618055555555556 | 0 |
| 0.7625000000000001 | 0 |
| 0.7631944444444444 | 0 |
| 0.7638888888888888 | 0 |
| 0.7645833333333334 | 0 |
| 0.7652777777777778 | 0 |
| 0.7659722222222222 | 0 |
| 0.7666666666666666 | 0 |
| 0.7673611111111112 | 0 |
| 0.7680555555555556 | 0 |
| 0.7687499999999999 | 0 |
| 0.7694444444444444 | 0 |
| 0.7701388888888889 | 0 |
| 0.7708333333333334 | 0 |
| 0.7715277777777777 | 0 |
| 0.7722222222222223 | 0 |
| 0.7729166666666667 | 0 |
| 0.7736111111111111 | 0 |
| 0.7743055555555555 | 0 |
| 0.775 | 0 |
| 0.7756944444444445 | 0 |
| 0.7763888888888889 | 0 |
| 0.7770833333333332 | 0 |
| 0.7777777777777778 | 0 |
| 0.7784722222222222 | 0 |
| 0.7791666666666667 | 0 |
| 0.779861111111111 | 0 |
| 0.7805555555555556 | 0 |
| 0.78125 | 0 |
| 0.7819444444444444 | 0 |
| 0.782638888888889 | 0 |
| 0.7833333333333333 | 0 |
| 0.7840277777777778 | 0 |
| 0.7847222222222222 | 0 |
| 0.7854166666666668 | 0 |
| 0.7861111111111111 | 0 |
| 0.7868055555555555 | 0 |
| 0.7875 | 0 |
| 0.7881944444444445 | 0 |
| 0.7888888888888889 | 0 |
| 0.7895833333333333 | 0 |
| 0.7902777777777777 | 0 |
| 0.7909722222222223 | 0 |
| 0.7916666666666666 | 0 |
| 0.7923611111111111 | 0 |
| 0.7930555555555556 | 0 |
| 0.7937500000000001 | 0 |
| 0.7944444444444444 | 0 |
| 0.7951388888888888 | 0 |
| 0.7958333333333334 | 0 |
| 0.7965277777777778 | 0 |
| 0.7972222222222222 | 0 |
| 0.7979166666666666 | 0 |
| 0.7986111111111112 | 0 |
| 0.7993055555555556 | 0 |
| 0.7999999999999999 | 0 |
| 0.8006944444444444 | 0 |
| 0.8013888888888889 | 0 |
| 0.8020833333333334 | 0 |
| 0.8027777777777777 | 0 |
| 0.8034722222222223 | 0 |
| 0.8041666666666667 | 0 |
| 0.8048611111111111 | 0 |
| 0.8055555555555555 | 0 |
| 0.80625 | 0 |
| 0.8069444444444445 | 0 |
| 0.8076388888888889 | 0 |
| 0.8083333333333332 | 0 |
| 0.8090277777777778 | 0 |
| 0.8097222222222222 | 0 |
| 0.8104166666666667 | 0 |
| 0.811111111111111 | 0 |
| 0.8118055555555556 | 0 |
| 0.8125 | 0 |
| 0.8131944444444444 | 0 |
| 0.813888888888889 | 0 |
| 0.8145833333333333 | 0 |
| 0.8152777777777778 | 0 |
| 0.8159722222222222 | 0 |
| 0.8166666666666668 | 0 |
| 0.8173611111111111 | 0 |
| 0.8180555555555555 | 0 |
| 0.81875 | 0 |
| 0.8194444444444445 | 0 |
| 0.8201388888888889 | 0 |
| 0.8208333333333333 | 0 |
| 0.8215277777777777 | 0 |
| 0.8222222222222223 | 0 |
| 0.8229166666666666 | 0 |
| 0.8236111111111111 | 0 |
| 0.8243055555555556 | 0 |
| 0.8250000000000001 | 0 |
| 0.8256944444444444 | 0 |
| 0.8263888888888888 | 0 |
| 0.8270833333333334 | 0 |
| 0.8277777777777778 | 0 |
| 0.8284722222222222 | 0 |
| 0.8291666666666666 | 0 |
| 0.8298611111111112 | 0 |
| 0.8305555555555556 | 0 |
| 0.8312499999999999 | 0 |
| 0.8319444444444444 | 0 |
| 0.8326388888888889 | 0 |
| 0.8333333333333334 | 0 |
| 0.8340277777777777 | 0 |
| 0.8347222222222223 | 0 |
| 0.8354166666666667 | 0 |
| 0.8361111111111111 | 0 |
| 0.8368055555555555 | 0 |
| 0.8375 | 0 |
| 0.8381944444444445 | 0 |
| 0.8388888888888889 | 0 |
| 0.8395833333333332 | 0 |
| 0.8402777777777778 | 0 |
| 0.8409722222222222 | 0 |
| 0.8416666666666667 | 0 |
| 0.842361111111111 | 0 |
| 0.8430555555555556 | 0 |
| 0.84375 | 0 |
| 0.8444444444444444 | 0 |
| 0.845138888888889 | 0 |
| 0.8458333333333333 | 0 |
| 0.8465277777777778 | 0 |
| 0.8472222222222222 | 0 |
| 0.8479166666666668 | 0 |
| 0.8486111111111111 | 0 |
| 0.8493055555555555 | 0 |
| 0.85 | 0 |
| 0.8506944444444445 | 0 |
| 0.8513888888888889 | 0 |
| 0.8520833333333333 | 0 |
| 0.8527777777777777 | 0 |
| 0.8534722222222223 | 0 |
| 0.8541666666666666 | 0 |
| 0.8548611111111111 | 0 |
| 0.8555555555555556 | 0 |
| 0.8562500000000001 | 0 |
| 0.8569444444444444 | 0 |
| 0.8576388888888888 | 0 |
| 0.8583333333333334 | 0 |
| 0.8590277777777778 | 0 |
| 0.8597222222222222 | 0 |
| 0.8604166666666666 | 0 |
| 0.8611111111111112 | 0 |
| 0.8618055555555556 | 0 |
| 0.8624999999999999 | 0 |
| 0.8631944444444444 | 0 |
| 0.8638888888888889 | 0 |
| 0.8645833333333334 | 0 |
| 0.8652777777777777 | 0 |
| 0.8659722222222223 | 0 |
| 0.8666666666666667 | 0 |
| 0.8673611111111111 | 0 |
| 0.8680555555555555 | 0 |
| 0.86875 | 0 |
| 0.8694444444444445 | 0 |
| 0.8701388888888889 | 0 |
| 0.8708333333333332 | 0 |
| 0.8715277777777778 | 0 |
| 0.8722222222222222 | 0 |
| 0.8729166666666667 | 0 |
| 0.873611111111111 | 0 |
| 0.8743055555555556 | 0 |
| 0.875 | 0 |
| 0.8756944444444444 | 0 |
| 0.876388888888889 | 0 |
| 0.8770833333333333 | 0 |
| 0.8777777777777778 | 0 |
| 0.8784722222222222 | 0 |
| 0.8791666666666668 | 0 |
| 0.8798611111111111 | 0 |
| 0.8805555555555555 | 0 |
| 0.88125 | 0 |
| 0.8819444444444445 | 0 |
| 0.8826388888888889 | 0 |
| 0.8833333333333333 | 0 |
| 0.8840277777777777 | 0 |
| 0.8847222222222223 | 0 |
| 0.8854166666666666 | 0 |
| 0.8861111111111111 | 0 |
| 0.8868055555555556 | 0 |
| 0.8875000000000001 | 0 |
| 0.8881944444444444 | 0 |
| 0.8888888888888888 | 0 |
| 0.8895833333333334 | 0 |
| 0.8902777777777778 | 0 |
| 0.8909722222222222 | 0 |
| 0.8916666666666666 | 0 |
| 0.8923611111111112 | 0 |
| 0.8930555555555556 | 0 |
| 0.8937499999999999 | 0 |
| 0.8944444444444444 | 0 |
| 0.8951388888888889 | 0 |
| 0.8958333333333334 | 0 |
| 0.8965277777777777 | 0 |
| 0.8972222222222223 | 0 |
| 0.8979166666666667 | 0 |
| 0.8986111111111111 | 0 |
| 0.8993055555555555 | 0 |
| 0.9 | 0 |
| 0.9006944444444445 | 0 |
| 0.9013888888888889 | 0 |
| 0.9020833333333332 | 0 |
| 0.9027777777777778 | 0 |
| 0.9034722222222222 | 0 |
| 0.9041666666666667 | 0 |
| 0.904861111111111 | 0 |
| 0.9055555555555556 | 0 |
| 0.90625 | 0 |
| 0.9069444444444444 | 0 |
| 0.907638888888889 | 0 |
| 0.9083333333333333 | 0 |
| 0.9090277777777778 | 0 |
| 0.9097222222222222 | 0 |
| 0.9104166666666668 | 0 |
| 0.9111111111111111 | 0 |
| 0.9118055555555555 | 0 |
| 0.9125 | 0 |
| 0.9131944444444445 | 0 |
| 0.9138888888888889 | 0 |
| 0.9145833333333333 | 0 |
| 0.9152777777777777 | 0 |
| 0.9159722222222223 | 0 |
| 0.9166666666666666 | 0 |
| 0.9173611111111111 | 0 |
| 0.9180555555555556 | 0 |
| 0.9187500000000001 | 0 |
| 0.9194444444444444 | 0 |
| 0.9201388888888888 | 0 |
| 0.9208333333333334 | 0 |
| 0.9215277777777778 | 0 |
| 0.9222222222222222 | 0 |
| 0.9229166666666666 | 0 |
| 0.9236111111111112 | 0 |
| 0.9243055555555556 | 0 |
| 0.9249999999999999 | 0 |
| 0.9256944444444444 | 0 |
| 0.9263888888888889 | 0 |
| 0.9270833333333334 | 0 |
| 0.9277777777777777 | 0 |
| 0.9284722222222223 | 0 |
| 0.9291666666666667 | 0 |
| 0.9298611111111111 | 0 |
| 0.9305555555555555 | 0 |
| 0.93125 | 0 |
| 0.9319444444444445 | 0 |
| 0.9326388888888889 | 0 |
| 0.9333333333333332 | 0 |
| 0.9340277777777778 | 0 |
| 0.9347222222222222 | 0 |
| 0.9354166666666667 | 0 |
| 0.936111111111111 | 0 |
| 0.9368055555555556 | 0 |
| 0.9375 | 0 |
| 0.9381944444444444 | 0 |
| 0.938888888888889 | 0 |
| 0.9395833333333333 | 0 |
| 0.9402777777777778 | 0 |
| 0.9409722222222222 | 0 |
| 0.9416666666666668 | 0 |
| 0.9423611111111111 | 0 |
| 0.9430555555555555 | 0 |
| 0.94375 | 0 |
| 0.9444444444444445 | 0 |
| 0.9451388888888889 | 0 |
| 0.9458333333333333 | 0 |
| 0.9465277777777777 | 0 |
| 0.9472222222222223 | 0 |
| 0.9479166666666666 | 0 |
| 0.9486111111111111 | 0 |
| 0.9493055555555556 | 0 |
| 0.9500000000000001 | 0 |
| 0.9506944444444444 | 0 |
| 0.9513888888888888 | 0 |
| 0.9520833333333334 | 0 |
| 0.9527777777777778 | 0 |
| 0.9534722222222222 | 0 |
| 0.9541666666666666 | 0 |
| 0.9548611111111112 | 0 |
| 0.9555555555555556 | 0 |
| 0.9562499999999999 | 0 |
| 0.9569444444444444 | 0 |
| 0.9576388888888889 | 0 |
| 0.9583333333333334 | 0 |
| 0.9590277777777777 | 0 |
| 0.9597222222222223 | 0 |
| 0.9604166666666667 | 0 |
| 0.9611111111111111 | 0 |
| 0.9618055555555555 | 0 |
| 0.9625 | 0 |
| 0.9631944444444445 | 0 |
| 0.9638888888888889 | 0 |
| 0.9645833333333332 | 0 |
| 0.9652777777777778 | 0 |
| 0.9659722222222222 | 0 |
| 0.9666666666666667 | 0 |
| 0.967361111111111 | 0 |
| 0.9680555555555556 | 0 |
| 0.96875 | 0 |
| 0.9694444444444444 | 0 |
| 0.970138888888889 | 0 |
| 0.9708333333333333 | 0 |
| 0.9715277777777778 | 0 |
| 0.9722222222222222 | 0 |
| 0.9729166666666668 | 0 |
| 0.9736111111111111 | 0 |
| 0.9743055555555555 | 0 |
| 0.975 | 0 |
| 0.9756944444444445 | 0 |
| 0.9763888888888889 | 0 |
| 0.9770833333333333 | 0 |
| 0.9777777777777777 | 0 |
| 0.9784722222222223 | 0 |
| 0.9791666666666666 | 0 |
| 0.9798611111111111 | 0 |
| 0.9805555555555556 | 0 |
| 0.9812500000000001 | 0 |
| 0.9819444444444444 | 0 |
| 0.9826388888888888 | 0 |
| 0.9833333333333334 | 0 |
| 0.9840277777777778 | 0 |
| 0.9847222222222222 | 0 |
| 0.9854166666666666 | 0 |
| 0.9861111111111112 | 0 |
| 0.9868055555555556 | 0 |
| 0.9874999999999999 | 0 |
| 0.9881944444444444 | 0 |
| 0.9888888888888889 | 0 |
| 0.9895833333333334 | 0 |
| 0.9902777777777777 | 0 |
| 0.9909722222222223 | 0 |
| 0.9916666666666667 | 0 |
| 0.9923611111111111 | 0 |
| 0.9930555555555555 | 0 |
| 0.99375 | 0 |
| 0.9944444444444445 | 0 |
| 0.9951388888888889 | 0 |
| 0.9958333333333332 | 0 |
| 0.9965277777777778 | 0 |
| 0.9972222222222222 | 0 |
| 0.9979166666666667 | 0 |
| 0.998611111111111 | 0 |
| 0.9993055555555556 | 0 |